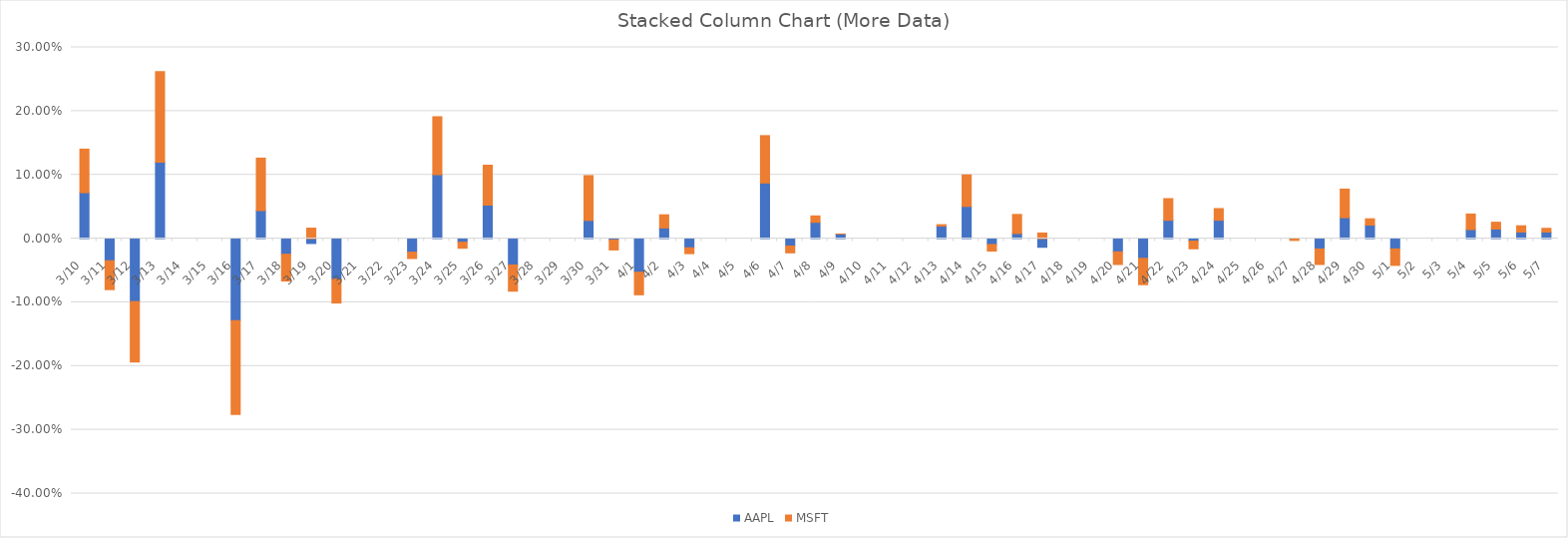
| Category | AAPL | MSFT |
|---|---|---|
| 2020-03-10 | 0.072 | 0.068 |
| 2020-03-11 | -0.035 | -0.045 |
| 2020-03-12 | -0.099 | -0.095 |
| 2020-03-13 | 0.12 | 0.142 |
| 2020-03-16 | -0.129 | -0.147 |
| 2020-03-17 | 0.044 | 0.082 |
| 2020-03-18 | -0.024 | -0.042 |
| 2020-03-19 | -0.008 | 0.016 |
| 2020-03-20 | -0.063 | -0.038 |
| 2020-03-23 | -0.021 | -0.01 |
| 2020-03-24 | 0.1 | 0.091 |
| 2020-03-25 | -0.006 | -0.01 |
| 2020-03-26 | 0.053 | 0.063 |
| 2020-03-27 | -0.041 | -0.041 |
| 2020-03-30 | 0.029 | 0.07 |
| 2020-03-31 | -0.002 | -0.016 |
| 2020-04-01 | -0.053 | -0.036 |
| 2020-04-02 | 0.017 | 0.021 |
| 2020-04-03 | -0.014 | -0.009 |
| 2020-04-06 | 0.087 | 0.074 |
| 2020-04-07 | -0.012 | -0.011 |
| 2020-04-08 | 0.026 | 0.01 |
| 2020-04-09 | 0.007 | 0 |
| 2020-04-13 | 0.02 | 0.002 |
| 2020-04-14 | 0.051 | 0.049 |
| 2020-04-15 | -0.009 | -0.01 |
| 2020-04-16 | 0.008 | 0.03 |
| 2020-04-17 | -0.014 | 0.009 |
| 2020-04-20 | -0.021 | -0.02 |
| 2020-04-21 | -0.031 | -0.041 |
| 2020-04-22 | 0.029 | 0.034 |
| 2020-04-23 | -0.004 | -0.012 |
| 2020-04-24 | 0.029 | 0.018 |
| 2020-04-27 | 0.001 | -0.003 |
| 2020-04-28 | -0.016 | -0.024 |
| 2020-04-29 | 0.033 | 0.045 |
| 2020-04-30 | 0.021 | 0.01 |
| 2020-05-01 | -0.016 | -0.026 |
| 2020-05-04 | 0.014 | 0.024 |
| 2020-05-05 | 0.015 | 0.011 |
| 2020-05-06 | 0.01 | 0.01 |
| 2020-05-07 | 0.01 | 0.006 |